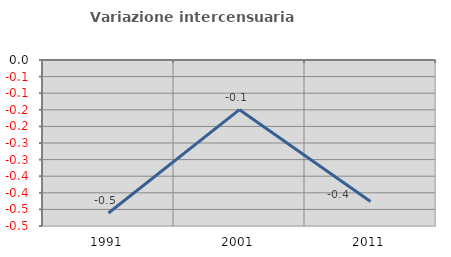
| Category | Variazione intercensuaria annua |
|---|---|
| 1991.0 | -0.461 |
| 2001.0 | -0.15 |
| 2011.0 | -0.426 |